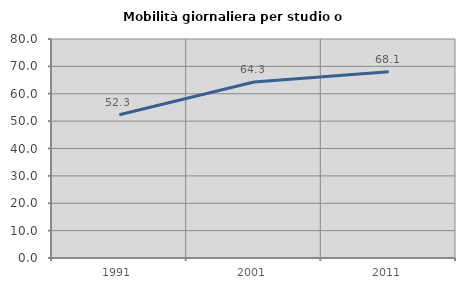
| Category | Mobilità giornaliera per studio o lavoro |
|---|---|
| 1991.0 | 52.317 |
| 2001.0 | 64.316 |
| 2011.0 | 68.061 |